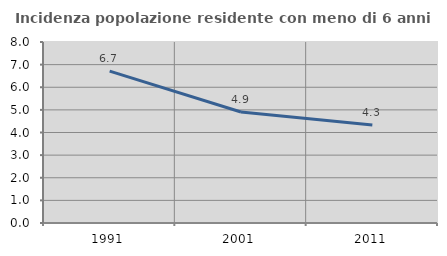
| Category | Incidenza popolazione residente con meno di 6 anni |
|---|---|
| 1991.0 | 6.711 |
| 2001.0 | 4.906 |
| 2011.0 | 4.329 |